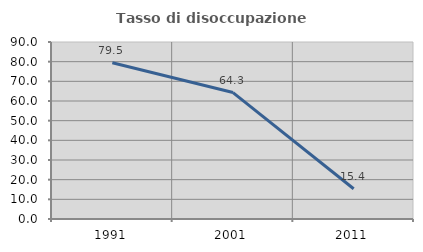
| Category | Tasso di disoccupazione giovanile  |
|---|---|
| 1991.0 | 79.487 |
| 2001.0 | 64.286 |
| 2011.0 | 15.385 |